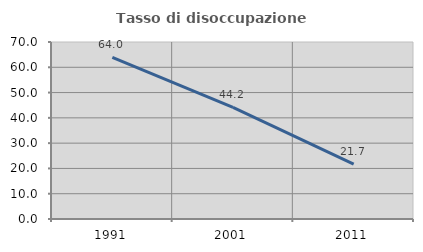
| Category | Tasso di disoccupazione giovanile  |
|---|---|
| 1991.0 | 63.964 |
| 2001.0 | 44.186 |
| 2011.0 | 21.739 |